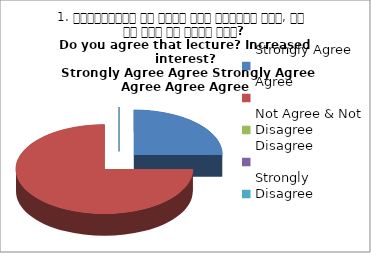
| Category | 1. व्याख्यान से रूचि में वृद्धि हुई, आप इस बात से सहमत हैं?
Do you agree that lecture? Increased interest?
 Strongly Agree Agree Strongly Agree Agree Agree Agree |
|---|---|
| Strongly Agree | 1 |
| Agree | 3 |
| Not Agree & Not Disagree | 0 |
| Disagree | 0 |
| Strongly Disagree | 0 |